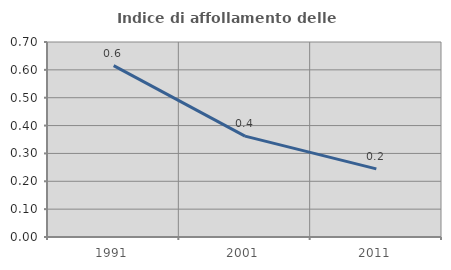
| Category | Indice di affollamento delle abitazioni  |
|---|---|
| 1991.0 | 0.615 |
| 2001.0 | 0.362 |
| 2011.0 | 0.245 |